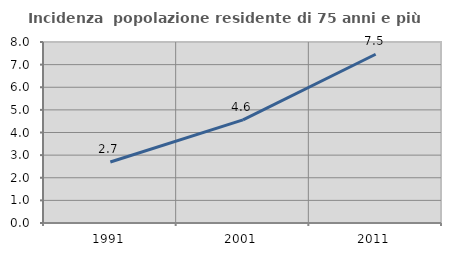
| Category | Incidenza  popolazione residente di 75 anni e più |
|---|---|
| 1991.0 | 2.697 |
| 2001.0 | 4.561 |
| 2011.0 | 7.46 |